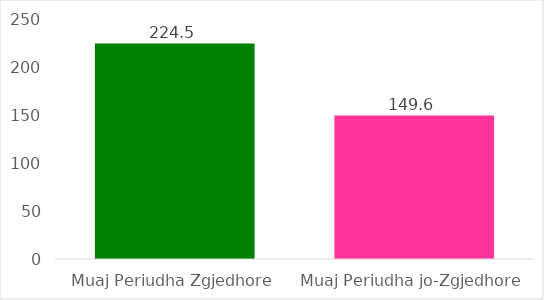
| Category | Mesatarisht Pagesa për Muaj |
|---|---|
| Muaj Periudha Zgjedhore | 224.5 |
| Muaj Periudha jo-Zgjedhore | 149.57 |